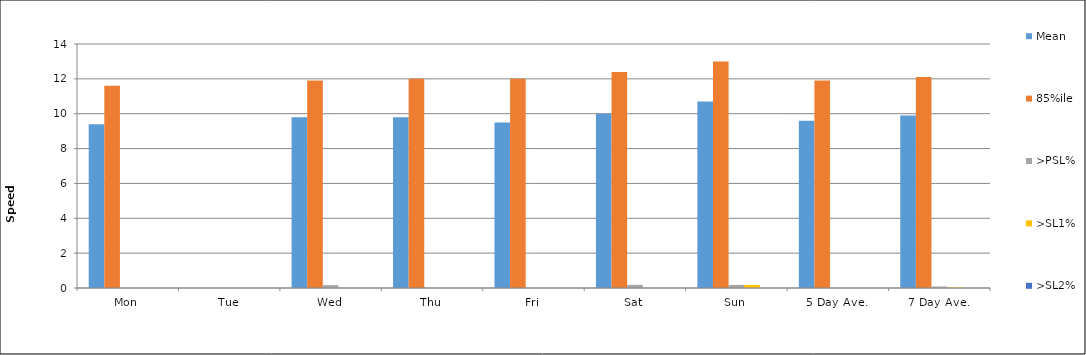
| Category | Mean | 85%ile | >PSL% | >SL1% | >SL2% |
|---|---|---|---|---|---|
| Mon | 9.4 | 11.6 | 0 | 0 | 0 |
| Tue | 0 | 0 | 0 | 0 | 0 |
| Wed | 9.8 | 11.9 | 0.163 | 0 | 0 |
| Thu | 9.8 | 12 | 0 | 0 | 0 |
| Fri | 9.5 | 12 | 0 | 0 | 0 |
| Sat | 10 | 12.4 | 0.183 | 0 | 0 |
| Sun | 10.7 | 13 | 0.178 | 0.178 | 0 |
| 5 Day Ave. | 9.6 | 11.9 | 0 | 0 | 0 |
| 7 Day Ave. | 9.9 | 12.1 | 0.087 | 0.029 | 0 |